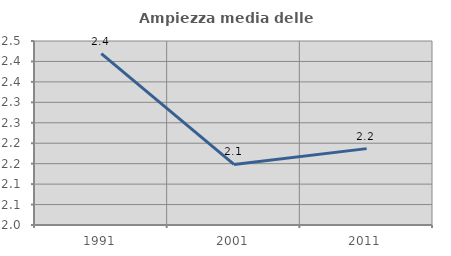
| Category | Ampiezza media delle famiglie |
|---|---|
| 1991.0 | 2.419 |
| 2001.0 | 2.148 |
| 2011.0 | 2.187 |